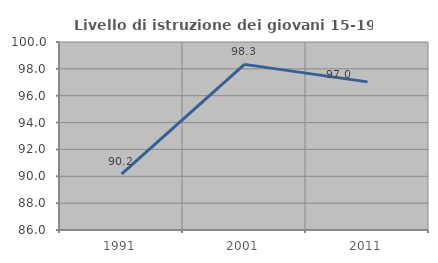
| Category | Livello di istruzione dei giovani 15-19 anni |
|---|---|
| 1991.0 | 90.164 |
| 2001.0 | 98.333 |
| 2011.0 | 97.03 |